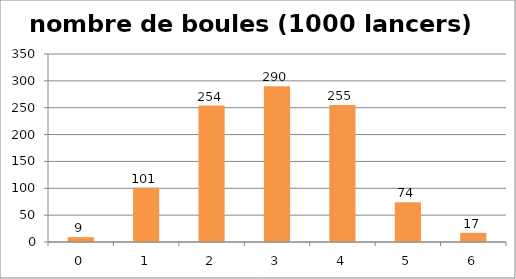
| Category | nombre de boules (1000 lancers) |
|---|---|
| 0.0 | 9 |
| 1.0 | 101 |
| 2.0 | 254 |
| 3.0 | 290 |
| 4.0 | 255 |
| 5.0 | 74 |
| 6.0 | 17 |